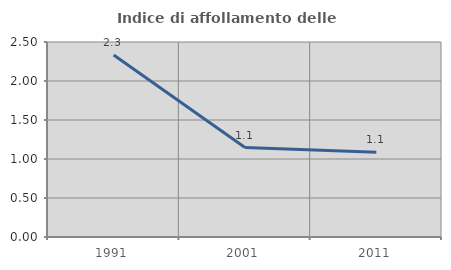
| Category | Indice di affollamento delle abitazioni  |
|---|---|
| 1991.0 | 2.333 |
| 2001.0 | 1.147 |
| 2011.0 | 1.088 |